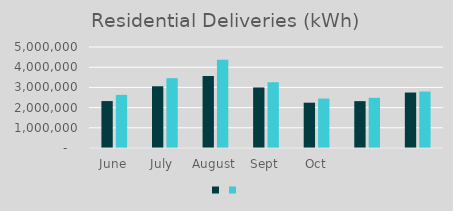
| Category | Series 1 | Series 0 |
|---|---|---|
| June | 2323720 | 2629934 |
| July  | 3056084 | 3456641 |
| August | 3564883 | 4364840 |
| Sept | 2997393 | 3255766 |
| Oct | 2243531 | 2448610 |